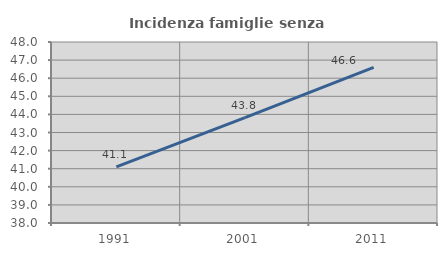
| Category | Incidenza famiglie senza nuclei |
|---|---|
| 1991.0 | 41.096 |
| 2001.0 | 43.825 |
| 2011.0 | 46.602 |